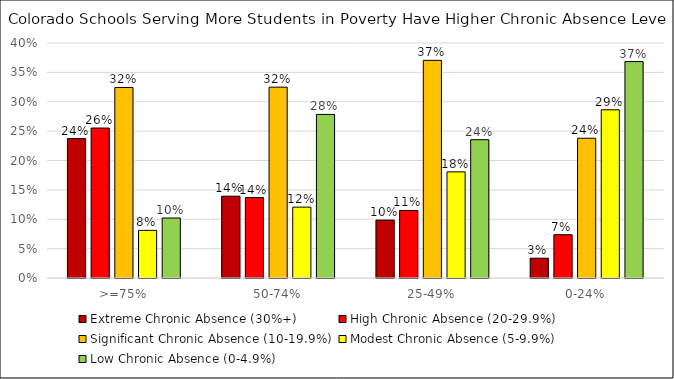
| Category | Extreme Chronic Absence (30%+) | High Chronic Absence (20-29.9%) | Significant Chronic Absence (10-19.9%) | Modest Chronic Absence (5-9.9%) | Low Chronic Absence (0-4.9%) |
|---|---|---|---|---|---|
| >=75% | 0.237 | 0.255 | 0.324 | 0.081 | 0.102 |
| 50-74% | 0.139 | 0.137 | 0.325 | 0.121 | 0.278 |
| 25-49% | 0.099 | 0.115 | 0.37 | 0.181 | 0.235 |
| 0-24% | 0.034 | 0.074 | 0.238 | 0.286 | 0.368 |